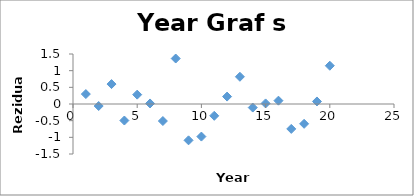
| Category | Series 0 |
|---|---|
| 1.0 | 0.298 |
| 2.0 | -0.061 |
| 3.0 | 0.598 |
| 4.0 | -0.496 |
| 5.0 | 0.281 |
| 6.0 | 0.016 |
| 7.0 | -0.511 |
| 8.0 | 1.364 |
| 9.0 | -1.09 |
| 10.0 | -0.978 |
| 11.0 | -0.354 |
| 12.0 | 0.223 |
| 13.0 | 0.817 |
| 14.0 | -0.107 |
| 15.0 | 0.017 |
| 16.0 | 0.099 |
| 17.0 | -0.747 |
| 18.0 | -0.594 |
| 19.0 | 0.076 |
| 20.0 | 1.148 |